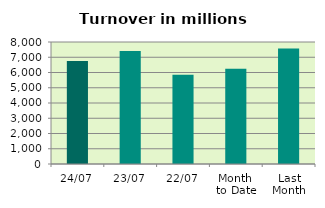
| Category | Series 0 |
|---|---|
| 24/07 | 6761.526 |
| 23/07 | 7412.889 |
| 22/07 | 5846.675 |
| Month 
to Date | 6253.246 |
| Last
Month | 7579.876 |